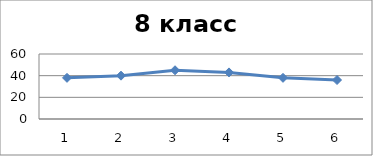
| Category | Series 0 |
|---|---|
| 0 | 38 |
| 1 | 40 |
| 2 | 45 |
| 3 | 43 |
| 4 | 38 |
| 5 | 36 |